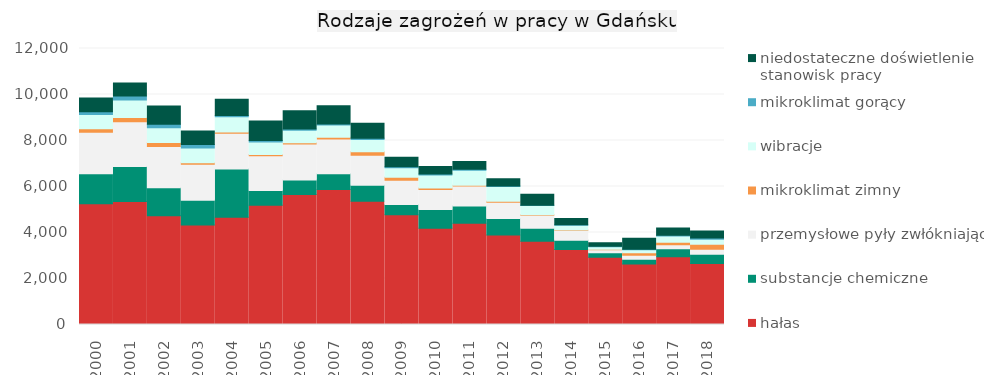
| Category | hałas | substancje chemiczne | przemysłowe pyły zwłókniające | mikroklimat zimny | wibracje | mikroklimat gorący | niedostateczne doświetlenie stanowisk pracy |
|---|---|---|---|---|---|---|---|
| 2000.0 | 5246 | 1304 | 1804 | 159 | 615 | 127 | 591 |
| 2001.0 | 5351 | 1518 | 1947 | 182 | 764 | 173 | 560 |
| 2002.0 | 4732 | 1218 | 1791 | 167 | 643 | 159 | 793 |
| 2003.0 | 4328 | 1069 | 1568 | 66 | 642 | 158 | 580 |
| 2004.0 | 4662 | 2098 | 1557 | 54 | 657 | 54 | 716 |
| 2005.0 | 5188 | 642 | 1502 | 54 | 553 | 57 | 847 |
| 2006.0 | 5652 | 633 | 1562 | 57 | 539 | 58 | 793 |
| 2007.0 | 5866 | 686 | 1514 | 76 | 533 | 39 | 801 |
| 2008.0 | 5362 | 694 | 1306 | 152 | 525 | 54 | 658 |
| 2009.0 | 4770 | 450 | 1048 | 132 | 413 | 41 | 419 |
| 2010.0 | 4183 | 812 | 876 | 65 | 563 | 40 | 331 |
| 2011.0 | 4398 | 754 | 870 | 29 | 658 | 37 | 336 |
| 2012.0 | 3894 | 717 | 705 | 42 | 642 | 22 | 313 |
| 2013.0 | 3616 | 573 | 566 | 18 | 401 | 16 | 476 |
| 2014.0 | 3266 | 398 | 420 | 21 | 213 | 16 | 272 |
| 2015.0 | 2919 | 200 | 129 | 29 | 108 | 16 | 156 |
| 2016.0 | 2629 | 212 | 167 | 112 | 126 | 29 | 473 |
| 2017.0 | 2947 | 344 | 181 | 107 | 264 | 40 | 316 |
| 2018.0 | 2653 | 405 | 209 | 219 | 218 | 52 | 307 |